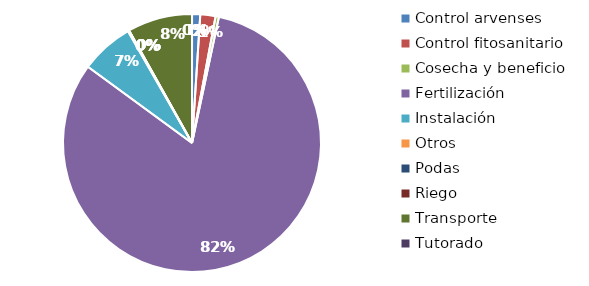
| Category | Valor |
|---|---|
| Control arvenses | 355000 |
| Control fitosanitario | 660000 |
| Cosecha y beneficio | 144000 |
| Fertilización | 28269840 |
| Instalación | 2306800 |
| Otros | 50000 |
| Podas | 0 |
| Riego | 0 |
| Transporte | 2812000 |
| Tutorado | 0 |